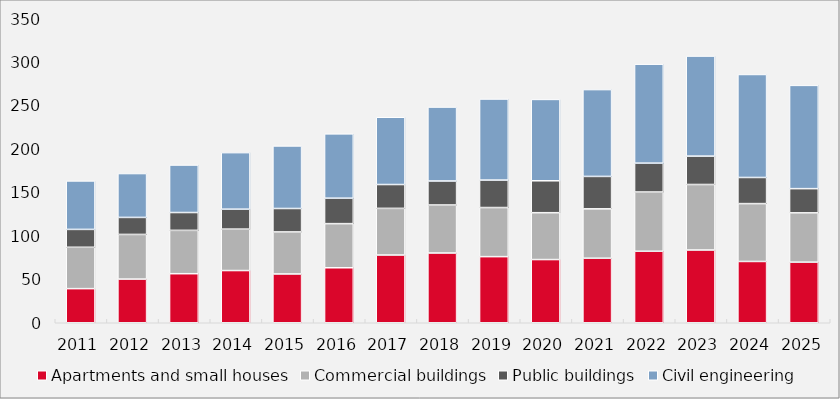
| Category | Apartments and small houses | Commercial buildings | Public buildings | Civil engineering |
|---|---|---|---|---|
| 2011.0 | 39.287 | 47.618 | 20.566 | 55.831 |
| 2012.0 | 50.282 | 51.403 | 19.591 | 50.516 |
| 2013.0 | 56.475 | 49.898 | 20.525 | 54.692 |
| 2014.0 | 60.107 | 47.69 | 22.961 | 65.112 |
| 2015.0 | 56.183 | 48.373 | 26.994 | 72.03 |
| 2016.0 | 63.311 | 50.808 | 29.277 | 74.068 |
| 2017.0 | 77.986 | 53.712 | 27.447 | 77.439 |
| 2018.0 | 80.318 | 55.253 | 27.635 | 85.121 |
| 2019.0 | 76.122 | 56.516 | 31.632 | 93.328 |
| 2020.0 | 72.762 | 53.942 | 36.752 | 93.667 |
| 2021.0 | 74.3 | 56.86 | 37.316 | 99.984 |
| 2022.0 | 82.313 | 68.206 | 33.238 | 113.945 |
| 2023.0 | 83.768 | 75.409 | 32.676 | 115.183 |
| 2024.0 | 70.563 | 66.615 | 30.078 | 118.581 |
| 2025.0 | 69.776 | 56.756 | 27.863 | 118.9 |